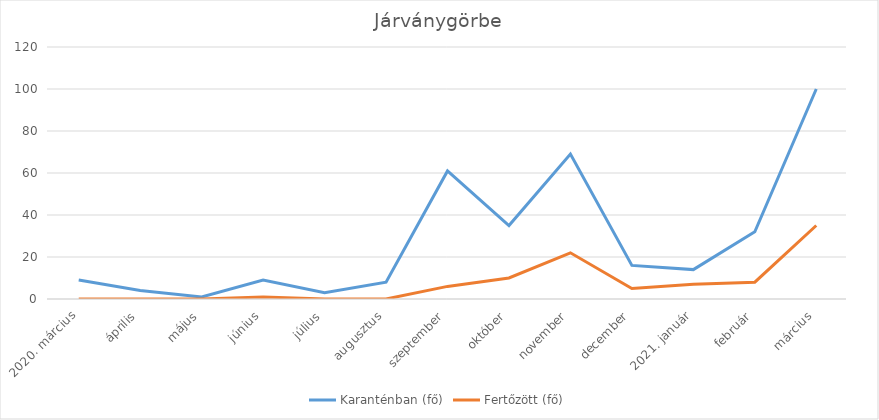
| Category | Karanténban (fő) | Fertőzött (fő) |
|---|---|---|
| 2020. március | 9 | 0 |
| április | 4 | 0 |
| május | 1 | 0 |
| június | 9 | 1 |
| július | 3 | 0 |
| augusztus | 8 | 0 |
| szeptember | 61 | 6 |
| október | 35 | 10 |
| november | 69 | 22 |
| december | 16 | 5 |
| 2021. január | 14 | 7 |
| február | 32 | 8 |
| március | 100 | 35 |